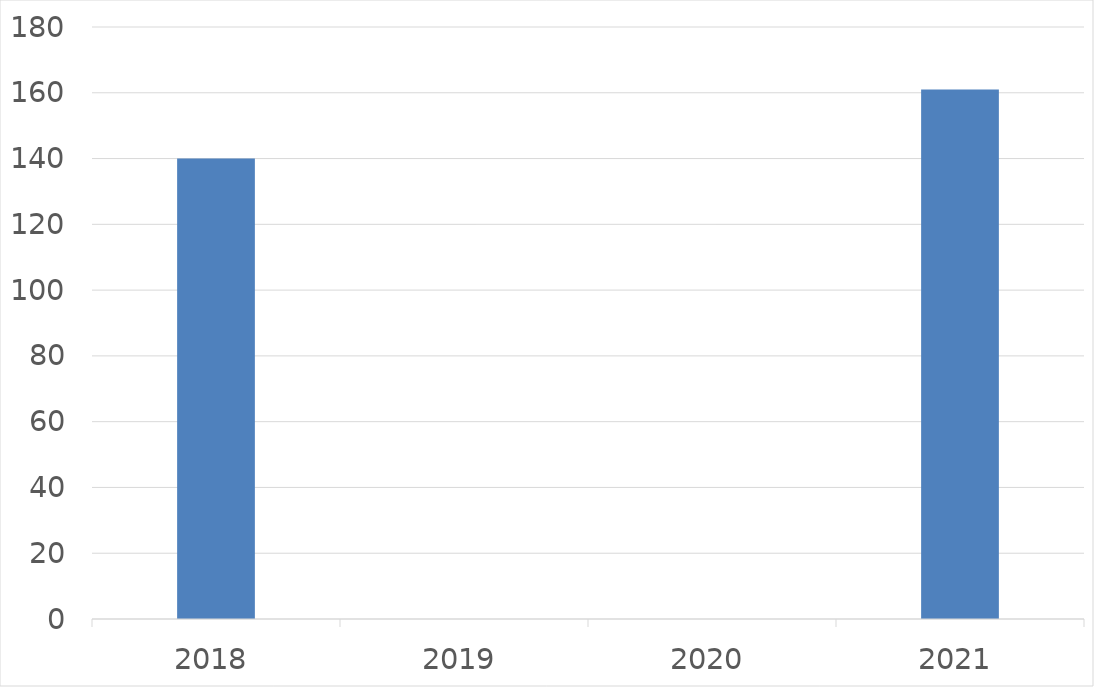
| Category | Series 0 |
|---|---|
| 2018 | 140 |
| 2019 | 0 |
| 2020 | 0 |
| 2021 | 161 |